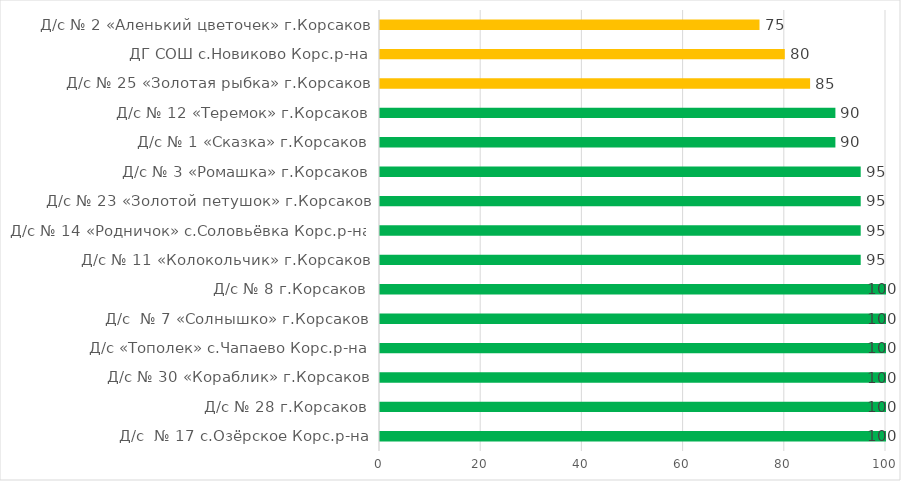
| Category | Series 0 |
|---|---|
| Д/с  № 17 с.Озёрское Корс.р-на | 100 |
| Д/с № 28 г.Корсаков | 100 |
| Д/с № 30 «Кораблик» г.Корсаков | 100 |
| Д/с «Тополек» с.Чапаево Корс.р-на | 100 |
| Д/с  № 7 «Солнышко» г.Корсаков | 100 |
| Д/с № 8 г.Корсаков | 100 |
| Д/с № 11 «Колокольчик» г.Корсаков | 95 |
| Д/с № 14 «Родничок» с.Соловьёвка Корс.р-на | 95 |
| Д/с № 23 «Золотой петушок» г.Корсаков | 95 |
| Д/с № 3 «Ромашка» г.Корсаков | 95 |
| Д/с № 1 «Сказка» г.Корсаков | 90 |
| Д/с № 12 «Теремок» г.Корсаков | 90 |
| Д/с № 25 «Золотая рыбка» г.Корсаков | 85 |
|  ДГ СОШ с.Новиково Корс.р-на | 80 |
| Д/с № 2 «Аленький цветочек» г.Корсаков | 75 |